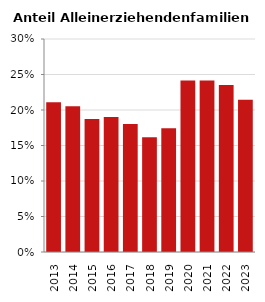
| Category | Anteil Alleinerziehende an Familien |
|---|---|
| 2013.0 | 0.211 |
| 2014.0 | 0.205 |
| 2015.0 | 0.187 |
| 2016.0 | 0.19 |
| 2017.0 | 0.18 |
| 2018.0 | 0.162 |
| 2019.0 | 0.174 |
| 2020.0 | 0.241 |
| 2021.0 | 0.241 |
| 2022.0 | 0.235 |
| 2023.0 | 0.215 |